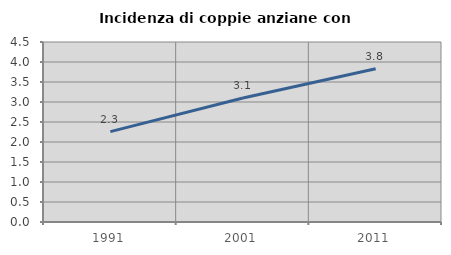
| Category | Incidenza di coppie anziane con figli |
|---|---|
| 1991.0 | 2.26 |
| 2001.0 | 3.098 |
| 2011.0 | 3.832 |